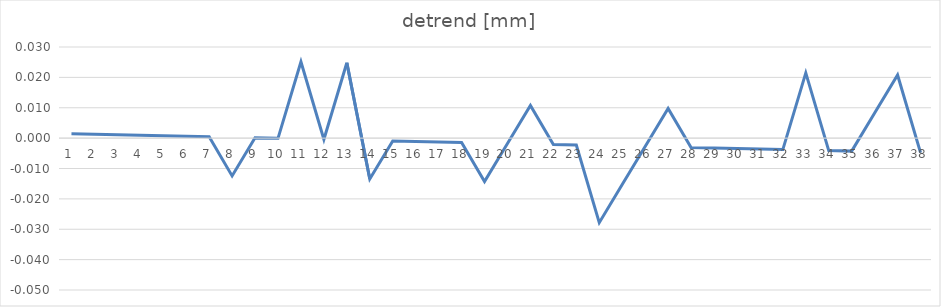
| Category | detrend [mm] |
|---|---|
| 0 | 0.001 |
| 1 | 0.001 |
| 2 | 0.001 |
| 3 | 0.001 |
| 4 | 0.001 |
| 5 | 0.001 |
| 6 | 0 |
| 7 | -0.012 |
| 8 | 0 |
| 9 | 0 |
| 10 | 0.025 |
| 11 | 0 |
| 12 | 0.025 |
| 13 | -0.013 |
| 14 | -0.001 |
| 15 | -0.001 |
| 16 | -0.001 |
| 17 | -0.001 |
| 18 | -0.014 |
| 19 | -0.002 |
| 20 | 0.011 |
| 21 | -0.002 |
| 22 | -0.002 |
| 23 | -0.028 |
| 24 | -0.015 |
| 25 | -0.003 |
| 26 | 0.01 |
| 27 | -0.003 |
| 28 | -0.003 |
| 29 | -0.003 |
| 30 | -0.004 |
| 31 | -0.004 |
| 32 | 0.021 |
| 33 | -0.004 |
| 34 | -0.004 |
| 35 | 0.008 |
| 36 | 0.021 |
| 37 | -0.005 |